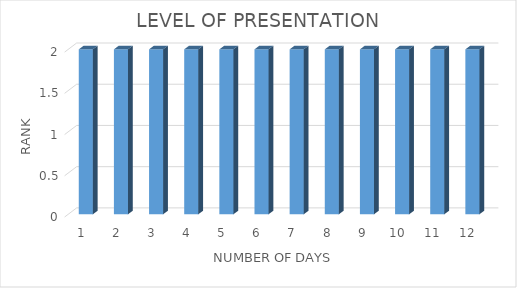
| Category | Series 0 |
|---|---|
| 0 | 2 |
| 1 | 2 |
| 2 | 2 |
| 3 | 2 |
| 4 | 2 |
| 5 | 2 |
| 6 | 2 |
| 7 | 2 |
| 8 | 2 |
| 9 | 2 |
| 10 | 2 |
| 11 | 2 |